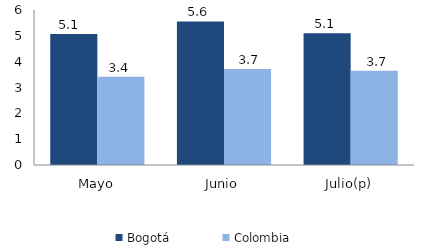
| Category | Bogotá | Colombia |
|---|---|---|
| Mayo | 5.073 | 3.419 |
| Junio | 5.559 | 3.712 |
| Julio(p) | 5.098 | 3.652 |